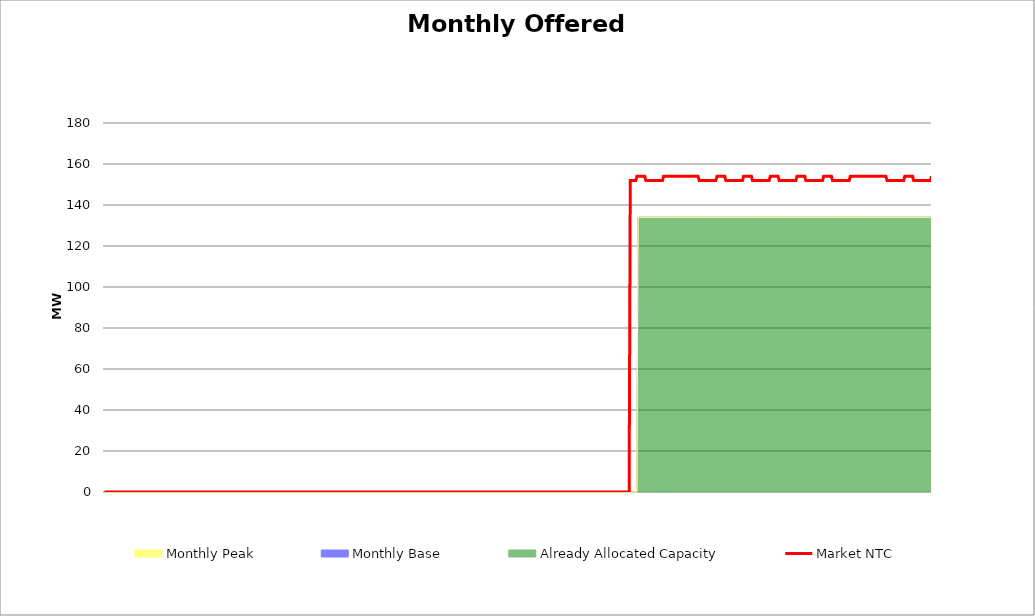
| Category | Market NTC |
|---|---|
| 0 | 0 |
| 1 | 0 |
| 2 | 0 |
| 3 | 0 |
| 4 | 0 |
| 5 | 0 |
| 6 | 0 |
| 7 | 0 |
| 8 | 0 |
| 9 | 0 |
| 10 | 0 |
| 11 | 0 |
| 12 | 0 |
| 13 | 0 |
| 14 | 0 |
| 15 | 0 |
| 16 | 0 |
| 17 | 0 |
| 18 | 0 |
| 19 | 0 |
| 20 | 0 |
| 21 | 0 |
| 22 | 0 |
| 23 | 0 |
| 24 | 0 |
| 25 | 0 |
| 26 | 0 |
| 27 | 0 |
| 28 | 0 |
| 29 | 0 |
| 30 | 0 |
| 31 | 0 |
| 32 | 0 |
| 33 | 0 |
| 34 | 0 |
| 35 | 0 |
| 36 | 0 |
| 37 | 0 |
| 38 | 0 |
| 39 | 0 |
| 40 | 0 |
| 41 | 0 |
| 42 | 0 |
| 43 | 0 |
| 44 | 0 |
| 45 | 0 |
| 46 | 0 |
| 47 | 0 |
| 48 | 0 |
| 49 | 0 |
| 50 | 0 |
| 51 | 0 |
| 52 | 0 |
| 53 | 0 |
| 54 | 0 |
| 55 | 0 |
| 56 | 0 |
| 57 | 0 |
| 58 | 0 |
| 59 | 0 |
| 60 | 0 |
| 61 | 0 |
| 62 | 0 |
| 63 | 0 |
| 64 | 0 |
| 65 | 0 |
| 66 | 0 |
| 67 | 0 |
| 68 | 0 |
| 69 | 0 |
| 70 | 0 |
| 71 | 0 |
| 72 | 0 |
| 73 | 0 |
| 74 | 0 |
| 75 | 0 |
| 76 | 0 |
| 77 | 0 |
| 78 | 0 |
| 79 | 0 |
| 80 | 0 |
| 81 | 0 |
| 82 | 0 |
| 83 | 0 |
| 84 | 0 |
| 85 | 0 |
| 86 | 0 |
| 87 | 0 |
| 88 | 0 |
| 89 | 0 |
| 90 | 0 |
| 91 | 0 |
| 92 | 0 |
| 93 | 0 |
| 94 | 0 |
| 95 | 0 |
| 96 | 0 |
| 97 | 0 |
| 98 | 0 |
| 99 | 0 |
| 100 | 0 |
| 101 | 0 |
| 102 | 0 |
| 103 | 0 |
| 104 | 0 |
| 105 | 0 |
| 106 | 0 |
| 107 | 0 |
| 108 | 0 |
| 109 | 0 |
| 110 | 0 |
| 111 | 0 |
| 112 | 0 |
| 113 | 0 |
| 114 | 0 |
| 115 | 0 |
| 116 | 0 |
| 117 | 0 |
| 118 | 0 |
| 119 | 0 |
| 120 | 0 |
| 121 | 0 |
| 122 | 0 |
| 123 | 0 |
| 124 | 0 |
| 125 | 0 |
| 126 | 0 |
| 127 | 0 |
| 128 | 0 |
| 129 | 0 |
| 130 | 0 |
| 131 | 0 |
| 132 | 0 |
| 133 | 0 |
| 134 | 0 |
| 135 | 0 |
| 136 | 0 |
| 137 | 0 |
| 138 | 0 |
| 139 | 0 |
| 140 | 0 |
| 141 | 0 |
| 142 | 0 |
| 143 | 0 |
| 144 | 0 |
| 145 | 0 |
| 146 | 0 |
| 147 | 0 |
| 148 | 0 |
| 149 | 0 |
| 150 | 0 |
| 151 | 0 |
| 152 | 0 |
| 153 | 0 |
| 154 | 0 |
| 155 | 0 |
| 156 | 0 |
| 157 | 0 |
| 158 | 0 |
| 159 | 0 |
| 160 | 0 |
| 161 | 0 |
| 162 | 0 |
| 163 | 0 |
| 164 | 0 |
| 165 | 0 |
| 166 | 0 |
| 167 | 0 |
| 168 | 0 |
| 169 | 0 |
| 170 | 0 |
| 171 | 0 |
| 172 | 0 |
| 173 | 0 |
| 174 | 0 |
| 175 | 0 |
| 176 | 0 |
| 177 | 0 |
| 178 | 0 |
| 179 | 0 |
| 180 | 0 |
| 181 | 0 |
| 182 | 0 |
| 183 | 0 |
| 184 | 0 |
| 185 | 0 |
| 186 | 0 |
| 187 | 0 |
| 188 | 0 |
| 189 | 0 |
| 190 | 0 |
| 191 | 0 |
| 192 | 0 |
| 193 | 0 |
| 194 | 0 |
| 195 | 0 |
| 196 | 0 |
| 197 | 0 |
| 198 | 0 |
| 199 | 0 |
| 200 | 0 |
| 201 | 0 |
| 202 | 0 |
| 203 | 0 |
| 204 | 0 |
| 205 | 0 |
| 206 | 0 |
| 207 | 0 |
| 208 | 0 |
| 209 | 0 |
| 210 | 0 |
| 211 | 0 |
| 212 | 0 |
| 213 | 0 |
| 214 | 0 |
| 215 | 0 |
| 216 | 0 |
| 217 | 0 |
| 218 | 0 |
| 219 | 0 |
| 220 | 0 |
| 221 | 0 |
| 222 | 0 |
| 223 | 0 |
| 224 | 0 |
| 225 | 0 |
| 226 | 0 |
| 227 | 0 |
| 228 | 0 |
| 229 | 0 |
| 230 | 0 |
| 231 | 0 |
| 232 | 0 |
| 233 | 0 |
| 234 | 0 |
| 235 | 0 |
| 236 | 0 |
| 237 | 0 |
| 238 | 0 |
| 239 | 0 |
| 240 | 0 |
| 241 | 0 |
| 242 | 0 |
| 243 | 0 |
| 244 | 0 |
| 245 | 0 |
| 246 | 0 |
| 247 | 0 |
| 248 | 0 |
| 249 | 0 |
| 250 | 0 |
| 251 | 0 |
| 252 | 0 |
| 253 | 0 |
| 254 | 0 |
| 255 | 0 |
| 256 | 0 |
| 257 | 0 |
| 258 | 0 |
| 259 | 0 |
| 260 | 0 |
| 261 | 0 |
| 262 | 0 |
| 263 | 0 |
| 264 | 0 |
| 265 | 0 |
| 266 | 0 |
| 267 | 0 |
| 268 | 0 |
| 269 | 0 |
| 270 | 0 |
| 271 | 0 |
| 272 | 0 |
| 273 | 0 |
| 274 | 0 |
| 275 | 0 |
| 276 | 0 |
| 277 | 0 |
| 278 | 0 |
| 279 | 0 |
| 280 | 0 |
| 281 | 0 |
| 282 | 0 |
| 283 | 0 |
| 284 | 0 |
| 285 | 0 |
| 286 | 0 |
| 287 | 0 |
| 288 | 0 |
| 289 | 0 |
| 290 | 0 |
| 291 | 0 |
| 292 | 0 |
| 293 | 0 |
| 294 | 0 |
| 295 | 0 |
| 296 | 0 |
| 297 | 0 |
| 298 | 0 |
| 299 | 0 |
| 300 | 0 |
| 301 | 0 |
| 302 | 0 |
| 303 | 0 |
| 304 | 0 |
| 305 | 0 |
| 306 | 0 |
| 307 | 0 |
| 308 | 0 |
| 309 | 0 |
| 310 | 0 |
| 311 | 0 |
| 312 | 0 |
| 313 | 0 |
| 314 | 0 |
| 315 | 0 |
| 316 | 0 |
| 317 | 0 |
| 318 | 0 |
| 319 | 0 |
| 320 | 0 |
| 321 | 0 |
| 322 | 0 |
| 323 | 0 |
| 324 | 0 |
| 325 | 0 |
| 326 | 0 |
| 327 | 0 |
| 328 | 0 |
| 329 | 0 |
| 330 | 0 |
| 331 | 0 |
| 332 | 0 |
| 333 | 0 |
| 334 | 0 |
| 335 | 0 |
| 336 | 0 |
| 337 | 0 |
| 338 | 0 |
| 339 | 0 |
| 340 | 0 |
| 341 | 0 |
| 342 | 0 |
| 343 | 0 |
| 344 | 0 |
| 345 | 0 |
| 346 | 0 |
| 347 | 0 |
| 348 | 0 |
| 349 | 0 |
| 350 | 0 |
| 351 | 0 |
| 352 | 0 |
| 353 | 0 |
| 354 | 0 |
| 355 | 0 |
| 356 | 0 |
| 357 | 0 |
| 358 | 0 |
| 359 | 0 |
| 360 | 0 |
| 361 | 0 |
| 362 | 0 |
| 363 | 0 |
| 364 | 0 |
| 365 | 0 |
| 366 | 0 |
| 367 | 0 |
| 368 | 0 |
| 369 | 0 |
| 370 | 0 |
| 371 | 0 |
| 372 | 0 |
| 373 | 0 |
| 374 | 0 |
| 375 | 0 |
| 376 | 0 |
| 377 | 0 |
| 378 | 0 |
| 379 | 0 |
| 380 | 0 |
| 381 | 0 |
| 382 | 0 |
| 383 | 0 |
| 384 | 0 |
| 385 | 0 |
| 386 | 0 |
| 387 | 0 |
| 388 | 0 |
| 389 | 0 |
| 390 | 0 |
| 391 | 0 |
| 392 | 0 |
| 393 | 0 |
| 394 | 0 |
| 395 | 0 |
| 396 | 0 |
| 397 | 0 |
| 398 | 0 |
| 399 | 0 |
| 400 | 0 |
| 401 | 0 |
| 402 | 0 |
| 403 | 0 |
| 404 | 0 |
| 405 | 0 |
| 406 | 0 |
| 407 | 0 |
| 408 | 0 |
| 409 | 0 |
| 410 | 0 |
| 411 | 0 |
| 412 | 0 |
| 413 | 0 |
| 414 | 0 |
| 415 | 0 |
| 416 | 0 |
| 417 | 0 |
| 418 | 0 |
| 419 | 0 |
| 420 | 0 |
| 421 | 0 |
| 422 | 0 |
| 423 | 0 |
| 424 | 0 |
| 425 | 0 |
| 426 | 0 |
| 427 | 0 |
| 428 | 0 |
| 429 | 0 |
| 430 | 0 |
| 431 | 0 |
| 432 | 0 |
| 433 | 0 |
| 434 | 0 |
| 435 | 0 |
| 436 | 0 |
| 437 | 0 |
| 438 | 0 |
| 439 | 0 |
| 440 | 0 |
| 441 | 0 |
| 442 | 0 |
| 443 | 0 |
| 444 | 0 |
| 445 | 0 |
| 446 | 0 |
| 447 | 0 |
| 448 | 0 |
| 449 | 0 |
| 450 | 0 |
| 451 | 0 |
| 452 | 0 |
| 453 | 0 |
| 454 | 0 |
| 455 | 0 |
| 456 | 0 |
| 457 | 0 |
| 458 | 0 |
| 459 | 0 |
| 460 | 0 |
| 461 | 0 |
| 462 | 0 |
| 463 | 0 |
| 464 | 0 |
| 465 | 0 |
| 466 | 0 |
| 467 | 0 |
| 468 | 0 |
| 469 | 0 |
| 470 | 0 |
| 471 | 0 |
| 472 | 0 |
| 473 | 152 |
| 474 | 152 |
| 475 | 152 |
| 476 | 152 |
| 477 | 152 |
| 478 | 152 |
| 479 | 154 |
| 480 | 154 |
| 481 | 154 |
| 482 | 154 |
| 483 | 154 |
| 484 | 154 |
| 485 | 154 |
| 486 | 154 |
| 487 | 152 |
| 488 | 152 |
| 489 | 152 |
| 490 | 152 |
| 491 | 152 |
| 492 | 152 |
| 493 | 152 |
| 494 | 152 |
| 495 | 152 |
| 496 | 152 |
| 497 | 152 |
| 498 | 152 |
| 499 | 152 |
| 500 | 152 |
| 501 | 152 |
| 502 | 152 |
| 503 | 154 |
| 504 | 154 |
| 505 | 154 |
| 506 | 154 |
| 507 | 154 |
| 508 | 154 |
| 509 | 154 |
| 510 | 154 |
| 511 | 154 |
| 512 | 154 |
| 513 | 154 |
| 514 | 154 |
| 515 | 154 |
| 516 | 154 |
| 517 | 154 |
| 518 | 154 |
| 519 | 154 |
| 520 | 154 |
| 521 | 154 |
| 522 | 154 |
| 523 | 154 |
| 524 | 154 |
| 525 | 154 |
| 526 | 154 |
| 527 | 154 |
| 528 | 154 |
| 529 | 154 |
| 530 | 154 |
| 531 | 154 |
| 532 | 154 |
| 533 | 154 |
| 534 | 154 |
| 535 | 152 |
| 536 | 152 |
| 537 | 152 |
| 538 | 152 |
| 539 | 152 |
| 540 | 152 |
| 541 | 152 |
| 542 | 152 |
| 543 | 152 |
| 544 | 152 |
| 545 | 152 |
| 546 | 152 |
| 547 | 152 |
| 548 | 152 |
| 549 | 152 |
| 550 | 152 |
| 551 | 154 |
| 552 | 154 |
| 553 | 154 |
| 554 | 154 |
| 555 | 154 |
| 556 | 154 |
| 557 | 154 |
| 558 | 154 |
| 559 | 152 |
| 560 | 152 |
| 561 | 152 |
| 562 | 152 |
| 563 | 152 |
| 564 | 152 |
| 565 | 152 |
| 566 | 152 |
| 567 | 152 |
| 568 | 152 |
| 569 | 152 |
| 570 | 152 |
| 571 | 152 |
| 572 | 152 |
| 573 | 152 |
| 574 | 152 |
| 575 | 154 |
| 576 | 154 |
| 577 | 154 |
| 578 | 154 |
| 579 | 154 |
| 580 | 154 |
| 581 | 154 |
| 582 | 154 |
| 583 | 152 |
| 584 | 152 |
| 585 | 152 |
| 586 | 152 |
| 587 | 152 |
| 588 | 152 |
| 589 | 152 |
| 590 | 152 |
| 591 | 152 |
| 592 | 152 |
| 593 | 152 |
| 594 | 152 |
| 595 | 152 |
| 596 | 152 |
| 597 | 152 |
| 598 | 152 |
| 599 | 154 |
| 600 | 154 |
| 601 | 154 |
| 602 | 154 |
| 603 | 154 |
| 604 | 154 |
| 605 | 154 |
| 606 | 154 |
| 607 | 152 |
| 608 | 152 |
| 609 | 152 |
| 610 | 152 |
| 611 | 152 |
| 612 | 152 |
| 613 | 152 |
| 614 | 152 |
| 615 | 152 |
| 616 | 152 |
| 617 | 152 |
| 618 | 152 |
| 619 | 152 |
| 620 | 152 |
| 621 | 152 |
| 622 | 152 |
| 623 | 154 |
| 624 | 154 |
| 625 | 154 |
| 626 | 154 |
| 627 | 154 |
| 628 | 154 |
| 629 | 154 |
| 630 | 154 |
| 631 | 152 |
| 632 | 152 |
| 633 | 152 |
| 634 | 152 |
| 635 | 152 |
| 636 | 152 |
| 637 | 152 |
| 638 | 152 |
| 639 | 152 |
| 640 | 152 |
| 641 | 152 |
| 642 | 152 |
| 643 | 152 |
| 644 | 152 |
| 645 | 152 |
| 646 | 152 |
| 647 | 154 |
| 648 | 154 |
| 649 | 154 |
| 650 | 154 |
| 651 | 154 |
| 652 | 154 |
| 653 | 154 |
| 654 | 154 |
| 655 | 152 |
| 656 | 152 |
| 657 | 152 |
| 658 | 152 |
| 659 | 152 |
| 660 | 152 |
| 661 | 152 |
| 662 | 152 |
| 663 | 152 |
| 664 | 152 |
| 665 | 152 |
| 666 | 152 |
| 667 | 152 |
| 668 | 152 |
| 669 | 152 |
| 670 | 152 |
| 671 | 154 |
| 672 | 154 |
| 673 | 154 |
| 674 | 154 |
| 675 | 154 |
| 676 | 154 |
| 677 | 154 |
| 678 | 154 |
| 679 | 154 |
| 680 | 154 |
| 681 | 154 |
| 682 | 154 |
| 683 | 154 |
| 684 | 154 |
| 685 | 154 |
| 686 | 154 |
| 687 | 154 |
| 688 | 154 |
| 689 | 154 |
| 690 | 154 |
| 691 | 154 |
| 692 | 154 |
| 693 | 154 |
| 694 | 154 |
| 695 | 154 |
| 696 | 154 |
| 697 | 154 |
| 698 | 154 |
| 699 | 154 |
| 700 | 154 |
| 701 | 154 |
| 702 | 154 |
| 703 | 154 |
| 704 | 152 |
| 705 | 152 |
| 706 | 152 |
| 707 | 152 |
| 708 | 152 |
| 709 | 152 |
| 710 | 152 |
| 711 | 152 |
| 712 | 152 |
| 713 | 152 |
| 714 | 152 |
| 715 | 152 |
| 716 | 152 |
| 717 | 152 |
| 718 | 152 |
| 719 | 152 |
| 720 | 154 |
| 721 | 154 |
| 722 | 154 |
| 723 | 154 |
| 724 | 154 |
| 725 | 154 |
| 726 | 154 |
| 727 | 154 |
| 728 | 152 |
| 729 | 152 |
| 730 | 152 |
| 731 | 152 |
| 732 | 152 |
| 733 | 152 |
| 734 | 152 |
| 735 | 152 |
| 736 | 152 |
| 737 | 152 |
| 738 | 152 |
| 739 | 152 |
| 740 | 152 |
| 741 | 152 |
| 742 | 152 |
| 743 | 152 |
| 744 | 154 |